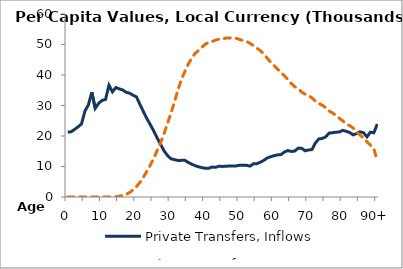
| Category | Private Transfers, Inflows | Private Transfers, Outflows |
|---|---|---|
| 0 | 21260.283 | 0 |
|  | 21390.39 | 0 |
| 2 | 22159.422 | 0 |
| 3 | 23003.542 | 0 |
| 4 | 23948.852 | 0 |
| 5 | 28176.835 | 0 |
| 6 | 30159.291 | 0 |
| 7 | 34353.597 | 0.021 |
| 8 | 29059.891 | 0.296 |
| 9 | 30743.89 | 0.297 |
| 10 | 31670.226 | 0.529 |
| 11 | 31999.394 | 1.173 |
| 12 | 36655.023 | 13.966 |
| 13 | 34470.614 | 22.059 |
| 14 | 35889.538 | 64.336 |
| 15 | 35442.43 | 266.32 |
| 16 | 35083.661 | 531.741 |
| 17 | 34318.256 | 877.607 |
| 18 | 34036.418 | 1480.09 |
| 19 | 33354.858 | 2328.68 |
| 20 | 32818.298 | 3444.227 |
| 21 | 30338.342 | 4799.663 |
| 22 | 28011.172 | 6463.124 |
| 23 | 25735.298 | 8386.072 |
| 24 | 23740.955 | 10408.552 |
| 25 | 21659.382 | 12722.35 |
| 26 | 19373.552 | 15217.734 |
| 27 | 17268.854 | 17796.259 |
| 28 | 15141.142 | 20694.973 |
| 29 | 13632.397 | 24121.233 |
| 30 | 12543.384 | 27397.122 |
| 31 | 12255.585 | 31003.468 |
| 32 | 11995.999 | 34997.204 |
| 33 | 12008.484 | 38392.662 |
| 34 | 12065.537 | 41000.479 |
| 35 | 11364.695 | 43459.339 |
| 36 | 10789.587 | 45472.013 |
| 37 | 10281.047 | 47052.927 |
| 38 | 9930.685 | 48005.884 |
| 39 | 9611.245 | 49072.287 |
| 40 | 9431.014 | 50098.243 |
| 41 | 9391.697 | 50718.374 |
| 42 | 9821.937 | 50983.624 |
| 43 | 9738.54 | 51422.848 |
| 44 | 10115.264 | 51758.944 |
| 45 | 10020.134 | 51808.482 |
| 46 | 10085.671 | 52114.341 |
| 47 | 10167.141 | 52171.467 |
| 48 | 10185.255 | 51964.298 |
| 49 | 10204.063 | 52038.666 |
| 50 | 10410.823 | 51642.554 |
| 51 | 10428.697 | 51295.196 |
| 52 | 10381.686 | 50999.133 |
| 53 | 10114.263 | 50370.597 |
| 54 | 10891.772 | 49623.857 |
| 55 | 10939.288 | 48794.935 |
| 56 | 11401.194 | 47966.467 |
| 57 | 12007.279 | 46925.323 |
| 58 | 12791.436 | 45553.021 |
| 59 | 13206.725 | 44205.894 |
| 60 | 13543.903 | 43102.229 |
| 61 | 13806.318 | 41981.641 |
| 62 | 13899.342 | 40788.323 |
| 63 | 14755.768 | 39791.179 |
| 64 | 15222.595 | 38515.931 |
| 65 | 14931.477 | 37213.127 |
| 66 | 15068.164 | 36181.927 |
| 67 | 16027.226 | 35544.625 |
| 68 | 15986.717 | 34423.114 |
| 69 | 15148.535 | 33734.245 |
| 70 | 15426.632 | 33274.288 |
| 71 | 15537.287 | 32504.502 |
| 72 | 17700.152 | 31468.597 |
| 73 | 19033.165 | 30665.927 |
| 74 | 19198.158 | 30103.824 |
| 75 | 19726.177 | 29286.195 |
| 76 | 20937.744 | 28182.102 |
| 77 | 21084.332 | 27559.97 |
| 78 | 21247.362 | 26731.243 |
| 79 | 21325.506 | 25804.504 |
| 80 | 21856.385 | 24929.348 |
| 81 | 21525.21 | 23873.742 |
| 82 | 21143.393 | 23393.055 |
| 83 | 20348.226 | 22607.309 |
| 84 | 20835.102 | 21323.416 |
| 85 | 21381.343 | 20295.33 |
| 86 | 21061.171 | 19283.271 |
| 87 | 19736.917 | 18141.291 |
| 88 | 21254.706 | 16961.695 |
| 89 | 21054.148 | 15933.945 |
| 90+ | 23930.694 | 11699.449 |